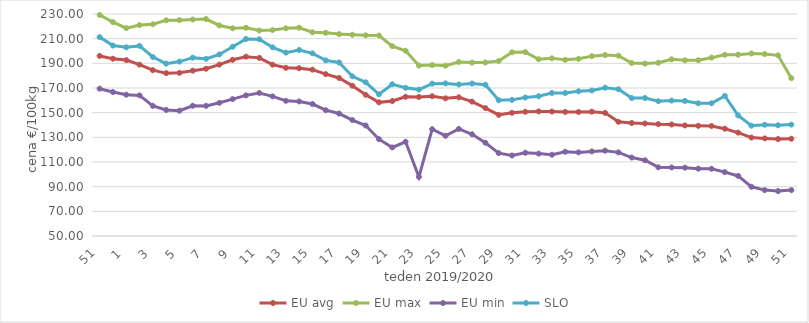
| Category | EU avg | EU max | EU min | SLO |
|---|---|---|---|---|
| 51.0 | 196.01 | 229.21 | 169.45 | 211.25 |
| 52.0 | 193.73 | 223.38 | 166.7 | 204.38 |
| 1.0 | 192.623 | 218.55 | 164.6 | 202.97 |
| 2.0 | 188.957 | 221 | 164 | 204.13 |
| 3.0 | 184.456 | 221.679 | 155.5 | 195.15 |
| 4.0 | 182.021 | 224.9 | 152.2 | 189.75 |
| 5.0 | 182.282 | 225.033 | 151.6 | 191.4 |
| 6.0 | 184.068 | 225.529 | 155.6 | 194.6 |
| 7.0 | 185.62 | 225.918 | 155.5 | 193.63 |
| 8.0 | 188.98 | 220.718 | 158 | 197.22 |
| 9.0 | 192.86 | 218.397 | 161 | 203.46 |
| 10.0 | 195.39 | 218.826 | 164 | 209.77 |
| 11.0 | 194.45 | 216.576 | 166 | 209.51 |
| 12.0 | 188.907 | 216.975 | 163.2 | 202.99 |
| 13.0 | 186.363 | 218.386 | 159.6 | 198.69 |
| 14.0 | 186.049 | 218.867 | 159.1 | 200.83 |
| 15.0 | 184.862 | 215.196 | 157 | 198.08 |
| 16.0 | 181.238 | 214.756 | 152 | 192.38 |
| 17.0 | 178.141 | 213.713 | 149.3 | 190.68 |
| 18.0 | 171.816 | 213.202 | 144 | 179.46 |
| 19.0 | 164.507 | 212.731 | 139.6 | 174.61 |
| 20.0 | 158.375 | 212.537 | 128.5 | 164.88 |
| 21.0 | 159.418 | 203.896 | 121.8 | 173.01 |
| 22.0 | 162.908 | 200.204 | 126.4 | 170.15 |
| 23.0 | 162.723 | 188.189 | 97.904 | 168.7 |
| 24.0 | 163.357 | 188.612 | 136.6 | 173.54 |
| 25.0 | 161.611 | 188.07 | 131.26 | 173.74 |
| 26.0 | 162.443 | 191.1 | 136.8 | 172.86 |
| 27.0 | 158.923 | 190.59 | 132.45 | 173.62 |
| 28.0 | 153.703 | 190.66 | 125.6 | 172.65 |
| 29.0 | 148.229 | 191.866 | 117.2 | 160.08 |
| 30.0 | 149.889 | 198.957 | 115.3 | 160.39 |
| 31.0 | 150.716 | 199.131 | 117.5 | 162.29 |
| 32.0 | 151.027 | 193.302 | 116.8 | 163.31 |
| 33.0 | 150.875 | 194.074 | 115.9 | 165.96 |
| 34.0 | 150.616 | 192.811 | 118.3 | 165.96 |
| 35.0 | 150.573 | 193.66 | 117.8 | 167.33 |
| 36.0 | 150.803 | 195.828 | 118.6 | 167.98 |
| 37.0 | 149.831 | 196.723 | 119.2 | 170.24 |
| 38.0 | 142.581 | 196.227 | 117.8 | 169.01 |
| 39.0 | 141.639 | 190.225 | 113.6 | 161.85 |
| 40.0 | 141.221 | 189.788 | 111.4 | 161.85 |
| 41.0 | 140.672 | 190.466 | 105.7 | 159.29 |
| 42.0 | 140.405 | 193.271 | 105.6 | 159.81 |
| 43.0 | 139.634 | 192.462 | 105.4 | 159.49 |
| 44.0 | 139.334 | 192.518 | 104.6 | 157.59 |
| 45.0 | 139.192 | 194.603 | 104.5 | 157.6 |
| 46.0 | 137.01 | 196.961 | 101.8 | 163.62 |
| 47.0 | 133.811 | 197.002 | 98.7 | 147.77 |
| 48.0 | 129.792 | 198.001 | 89.9 | 139.45 |
| 49.0 | 129.139 | 197.508 | 87.2 | 140.23 |
| 50.0 | 128.585 | 196.469 | 86.4 | 139.77 |
| 51.0 | 128.852 | 177.942 | 87.2 | 140.32 |